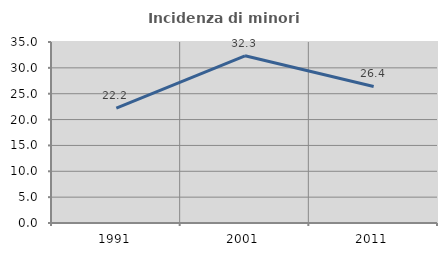
| Category | Incidenza di minori stranieri |
|---|---|
| 1991.0 | 22.222 |
| 2001.0 | 32.335 |
| 2011.0 | 26.411 |